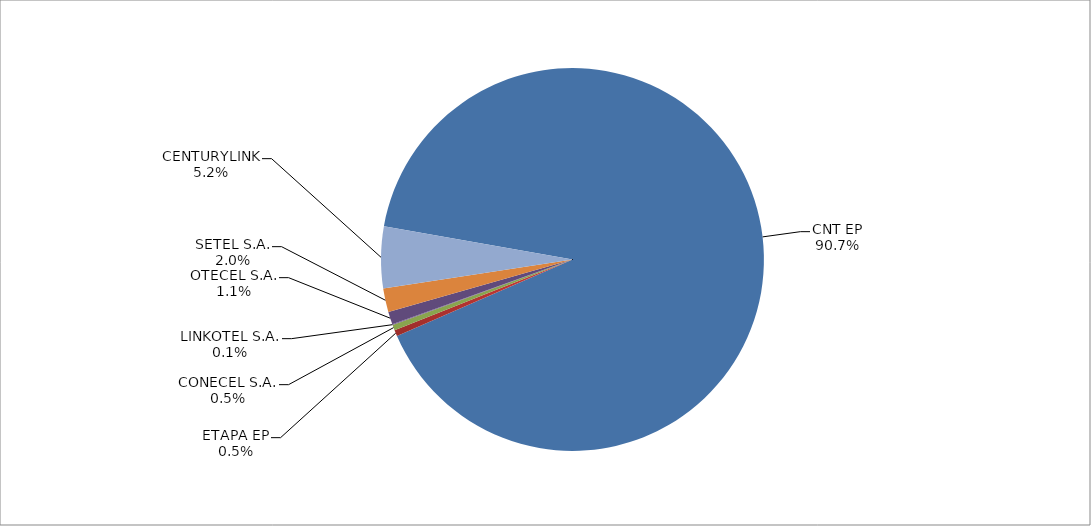
| Category | Series 0 |
|---|---|
| CNT EP | 2937 |
| ETAPA EP | 17 |
| CONECEL S.A. | 15 |
| LINKOTEL S.A. | 2 |
| OTECEL S.A. | 35 |
| SETEL S.A. | 65 |
| CENTURYLINK | 168 |